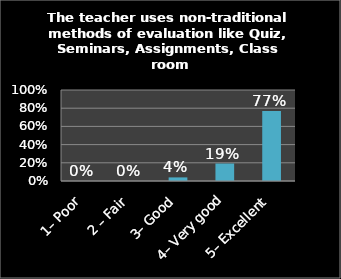
| Category | Series 0 |
|---|---|
| 1– Poor | 0 |
| 2 – Fair | 0 |
| 3– Good | 0.04 |
| 4– Very good | 0.192 |
| 5– Excellent | 0.768 |